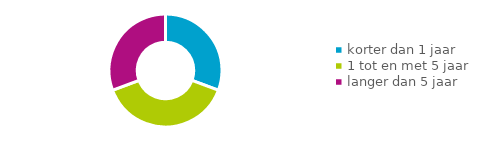
| Category | Inschrijfplichtig |
|---|---|
| korter dan 1 jaar | 135 |
| 1 tot en met 5 jaar | 170 |
| langer dan 5 jaar | 135 |